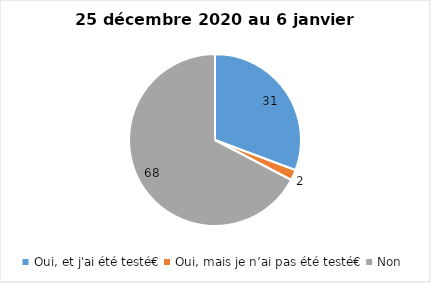
| Category | Series 0 |
|---|---|
| Oui, et j'ai été testé€ | 31 |
| Oui, mais je n’ai pas été testé€ | 2 |
| Non | 68 |